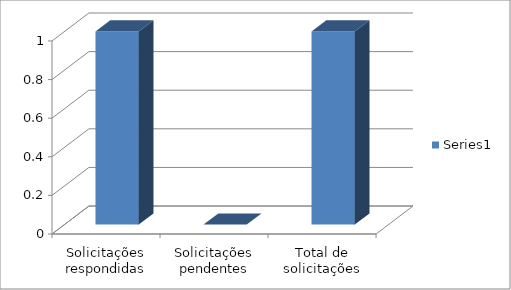
| Category | Series 0 |
|---|---|
| Solicitações respondidas | 1 |
| Solicitações pendentes | 0 |
| Total de solicitações | 1 |